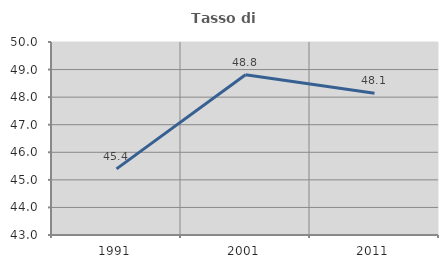
| Category | Tasso di occupazione   |
|---|---|
| 1991.0 | 45.398 |
| 2001.0 | 48.815 |
| 2011.0 | 48.142 |